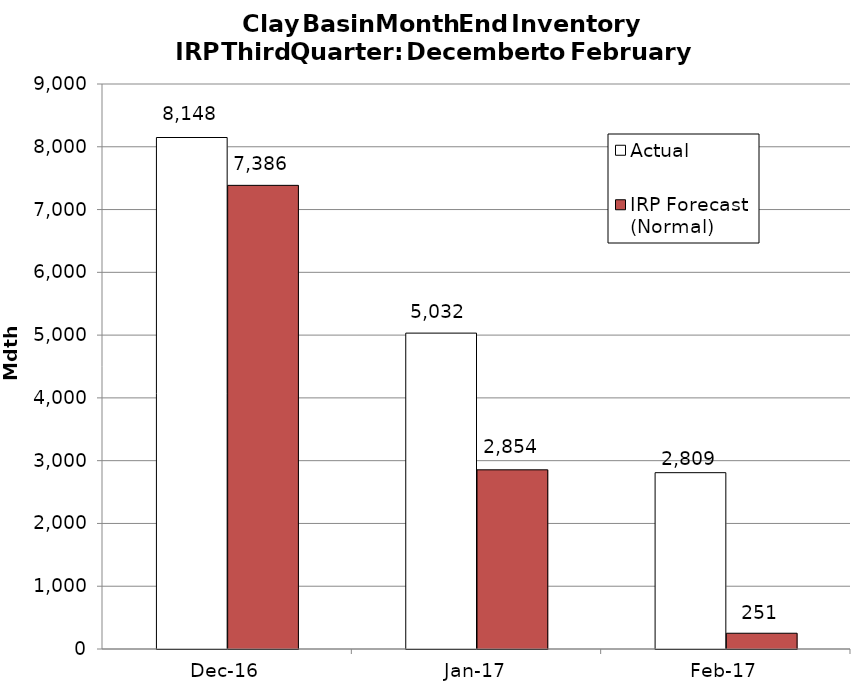
| Category | Actual | IRP Forecast (Normal) |
|---|---|---|
| 2016-12-01 | 8147.765 | 7385.533 |
| 2017-01-01 | 5031.858 | 2854.078 |
| 2017-02-01 | 2808.559 | 250.935 |